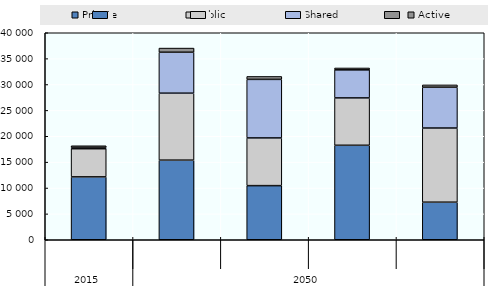
| Category | Private | Public | Shared | Active |
|---|---|---|---|---|
| 0 | 12148.208 | 5446.252 | 266.97 | 302.481 |
| 1 | 15383.359 | 12938.57 | 7913.203 | 805.058 |
| 2 | 10456.893 | 9219.098 | 11317.139 | 567.034 |
| 3 | 18255.801 | 9151.91 | 5425.281 | 362.306 |
| 4 | 7259.72 | 14330.715 | 7878.522 | 458.014 |